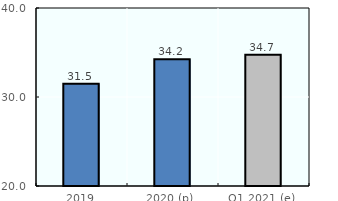
| Category | OECD pension fund assets |
|---|---|
| 2019 | 31.496 |
| 2020 (p) | 34.246 |
| Q1 2021 (e) | 34.745 |